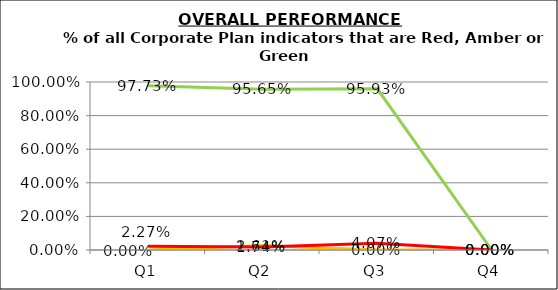
| Category | Green | Amber | Red |
|---|---|---|---|
| Q1 | 0.977 | 0 | 0.023 |
| Q2 | 0.957 | 0.026 | 0.017 |
| Q3 | 0.959 | 0 | 0.041 |
| Q4 | 0 | 0 | 0 |